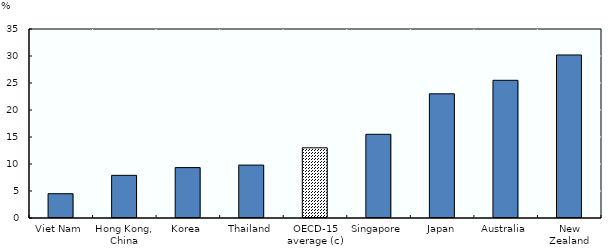
| Category | % |
|---|---|
| Viet Nam | 4.5 |
| Hong Kong, China | 7.9 |
| Korea | 9.334 |
| Thailand | 9.8 |
| OECD-15 average (c) | 12.996 |
| Singapore | 15.5 |
| Japan | 23 |
| Australia | 25.5 |
| New Zealand | 30.189 |